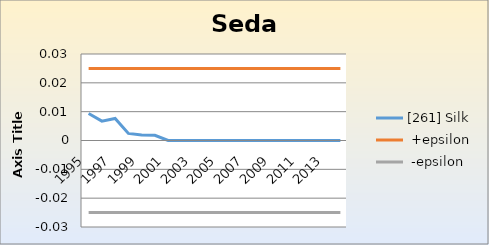
| Category | [261] Silk |  +epsilon |  -epsilon |
|---|---|---|---|
| 1995.0 | 0.009 | 0.025 | -0.025 |
| 1996.0 | 0.007 | 0.025 | -0.025 |
| 1997.0 | 0.008 | 0.025 | -0.025 |
| 1998.0 | 0.002 | 0.025 | -0.025 |
| 1999.0 | 0.002 | 0.025 | -0.025 |
| 2000.0 | 0.002 | 0.025 | -0.025 |
| 2001.0 | 0 | 0.025 | -0.025 |
| 2002.0 | 0 | 0.025 | -0.025 |
| 2003.0 | 0 | 0.025 | -0.025 |
| 2004.0 | 0 | 0.025 | -0.025 |
| 2005.0 | 0 | 0.025 | -0.025 |
| 2006.0 | 0 | 0.025 | -0.025 |
| 2007.0 | 0 | 0.025 | -0.025 |
| 2008.0 | 0 | 0.025 | -0.025 |
| 2009.0 | 0 | 0.025 | -0.025 |
| 2010.0 | 0 | 0.025 | -0.025 |
| 2011.0 | 0 | 0.025 | -0.025 |
| 2012.0 | 0 | 0.025 | -0.025 |
| 2013.0 | 0 | 0.025 | -0.025 |
| 2014.0 | 0 | 0.025 | -0.025 |